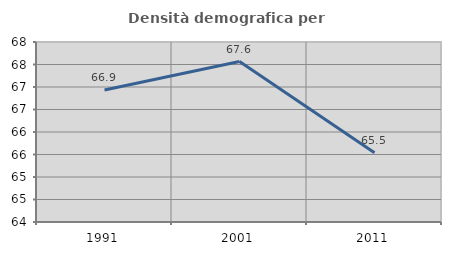
| Category | Densità demografica |
|---|---|
| 1991.0 | 66.933 |
| 2001.0 | 67.566 |
| 2011.0 | 65.541 |